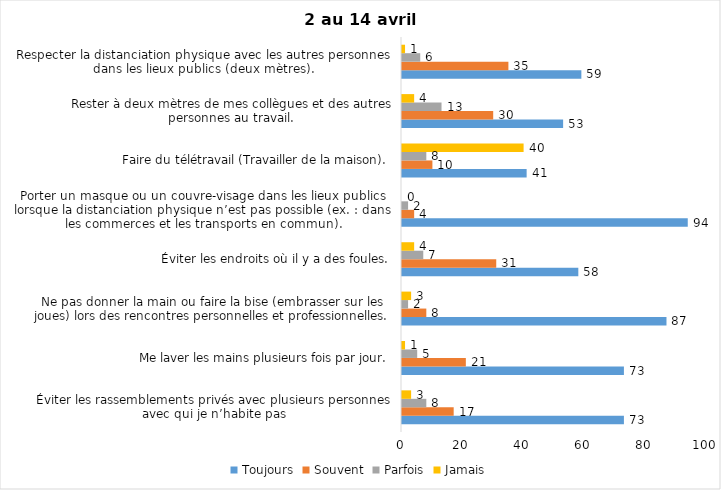
| Category | Toujours | Souvent | Parfois | Jamais |
|---|---|---|---|---|
| Éviter les rassemblements privés avec plusieurs personnes avec qui je n’habite pas | 73 | 17 | 8 | 3 |
| Me laver les mains plusieurs fois par jour. | 73 | 21 | 5 | 1 |
| Ne pas donner la main ou faire la bise (embrasser sur les joues) lors des rencontres personnelles et professionnelles. | 87 | 8 | 2 | 3 |
| Éviter les endroits où il y a des foules. | 58 | 31 | 7 | 4 |
| Porter un masque ou un couvre-visage dans les lieux publics lorsque la distanciation physique n’est pas possible (ex. : dans les commerces et les transports en commun). | 94 | 4 | 2 | 0 |
| Faire du télétravail (Travailler de la maison). | 41 | 10 | 8 | 40 |
| Rester à deux mètres de mes collègues et des autres personnes au travail. | 53 | 30 | 13 | 4 |
| Respecter la distanciation physique avec les autres personnes dans les lieux publics (deux mètres). | 59 | 35 | 6 | 1 |